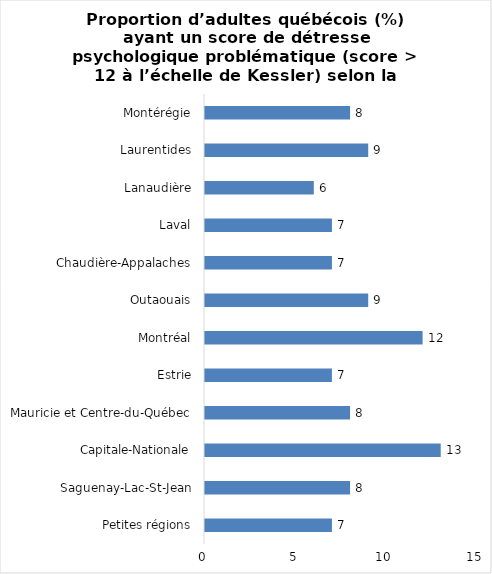
| Category | Series 0 |
|---|---|
| Petites régions | 7 |
| Saguenay-Lac-St-Jean | 8 |
| Capitale-Nationale | 13 |
| Mauricie et Centre-du-Québec | 8 |
| Estrie | 7 |
| Montréal | 12 |
| Outaouais | 9 |
| Chaudière-Appalaches | 7 |
| Laval | 7 |
| Lanaudière | 6 |
| Laurentides | 9 |
| Montérégie | 8 |